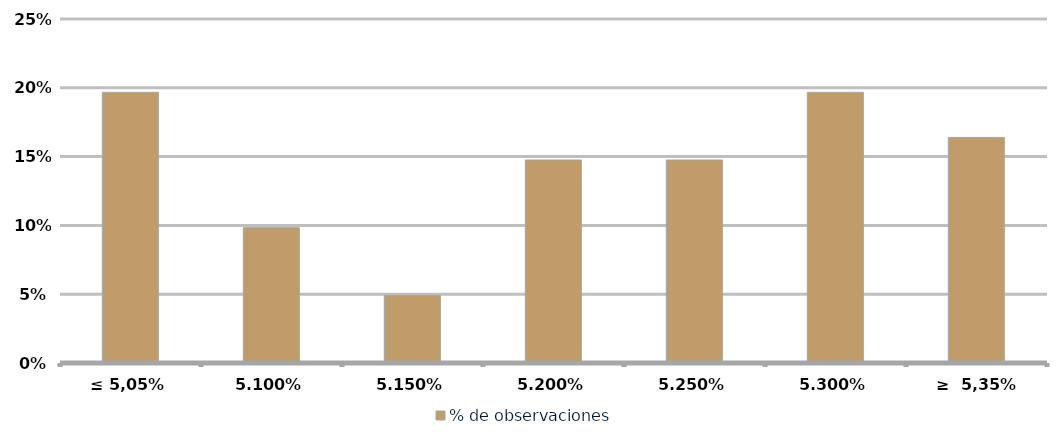
| Category | % de observaciones  |
|---|---|
| ≤ 5,05% | 0.197 |
| 5.10% | 0.098 |
| 5.15% | 0.049 |
| 5.20% | 0.148 |
| 5.25% | 0.148 |
| 5.30% | 0.197 |
| ≥  5,35% | 0.164 |